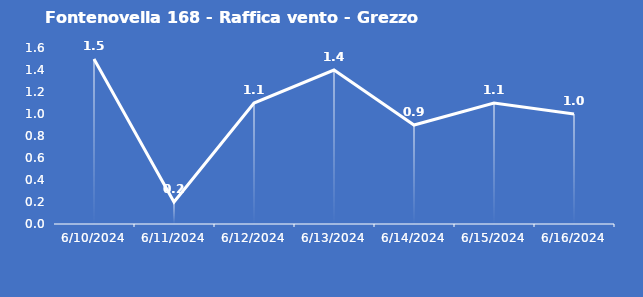
| Category | Fontenovella 168 - Raffica vento - Grezzo (m/s) |
|---|---|
| 6/10/24 | 1.5 |
| 6/11/24 | 0.2 |
| 6/12/24 | 1.1 |
| 6/13/24 | 1.4 |
| 6/14/24 | 0.9 |
| 6/15/24 | 1.1 |
| 6/16/24 | 1 |